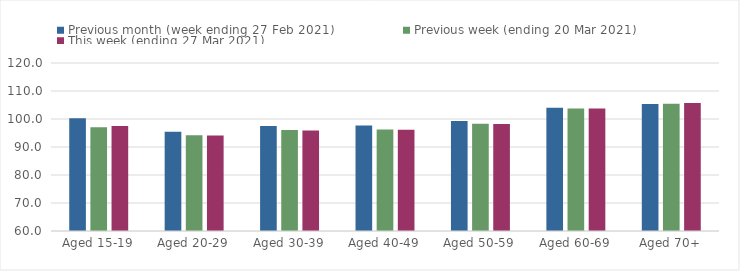
| Category | Previous month (week ending 27 Feb 2021) | Previous week (ending 20 Mar 2021) | This week (ending 27 Mar 2021) |
|---|---|---|---|
| Aged 15-19 | 100.27 | 97.01 | 97.49 |
| Aged 20-29 | 95.48 | 94.24 | 94.07 |
| Aged 30-39 | 97.5 | 96.08 | 95.9 |
| Aged 40-49 | 97.7 | 96.24 | 96.15 |
| Aged 50-59 | 99.32 | 98.32 | 98.21 |
| Aged 60-69 | 104 | 103.75 | 103.73 |
| Aged 70+ | 105.33 | 105.47 | 105.67 |